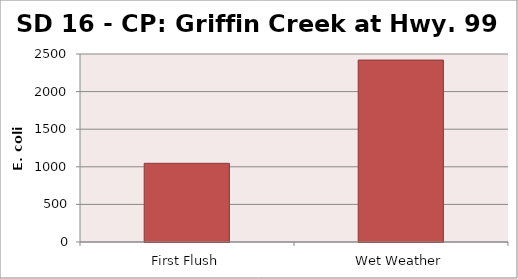
| Category | E. coli MPN - |
|---|---|
| First Flush | 1046.2 |
| Wet Weather | 2419.2 |